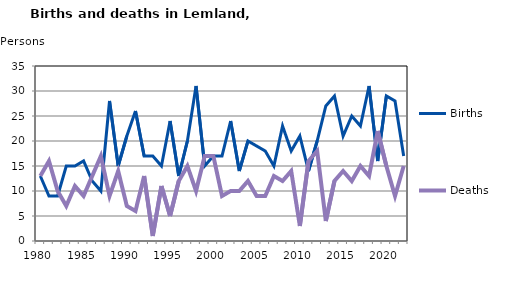
| Category | Births | Deaths |
|---|---|---|
| 1980.0 | 13 | 13 |
| 1981.0 | 9 | 16 |
| 1982.0 | 9 | 10 |
| 1983.0 | 15 | 7 |
| 1984.0 | 15 | 11 |
| 1985.0 | 16 | 9 |
| 1986.0 | 12 | 13 |
| 1987.0 | 10 | 17 |
| 1988.0 | 28 | 9 |
| 1989.0 | 15 | 14 |
| 1990.0 | 21 | 7 |
| 1991.0 | 26 | 6 |
| 1992.0 | 17 | 13 |
| 1993.0 | 17 | 1 |
| 1994.0 | 15 | 11 |
| 1995.0 | 24 | 5 |
| 1996.0 | 13 | 12 |
| 1997.0 | 20 | 15 |
| 1998.0 | 31 | 10 |
| 1999.0 | 15 | 17 |
| 2000.0 | 17 | 17 |
| 2001.0 | 17 | 9 |
| 2002.0 | 24 | 10 |
| 2003.0 | 14 | 10 |
| 2004.0 | 20 | 12 |
| 2005.0 | 19 | 9 |
| 2006.0 | 18 | 9 |
| 2007.0 | 15 | 13 |
| 2008.0 | 23 | 12 |
| 2009.0 | 18 | 14 |
| 2010.0 | 21 | 3 |
| 2011.0 | 14 | 16 |
| 2012.0 | 20 | 18 |
| 2013.0 | 27 | 4 |
| 2014.0 | 29 | 12 |
| 2015.0 | 21 | 14 |
| 2016.0 | 25 | 12 |
| 2017.0 | 23 | 15 |
| 2018.0 | 31 | 13 |
| 2019.0 | 16 | 22 |
| 2020.0 | 29 | 15 |
| 2021.0 | 28 | 9 |
| 2022.0 | 17 | 15 |